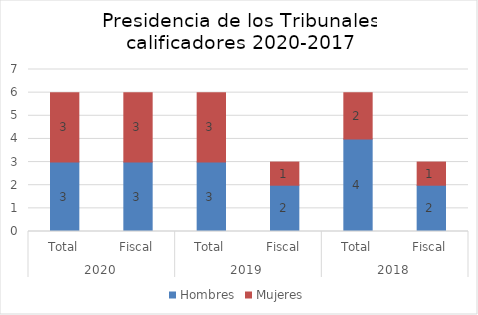
| Category | Hombres | Mujeres |
|---|---|---|
| 0 | 3 | 3 |
| 1 | 3 | 3 |
| 2 | 3 | 3 |
| 3 | 2 | 1 |
| 4 | 4 | 2 |
| 5 | 2 | 1 |